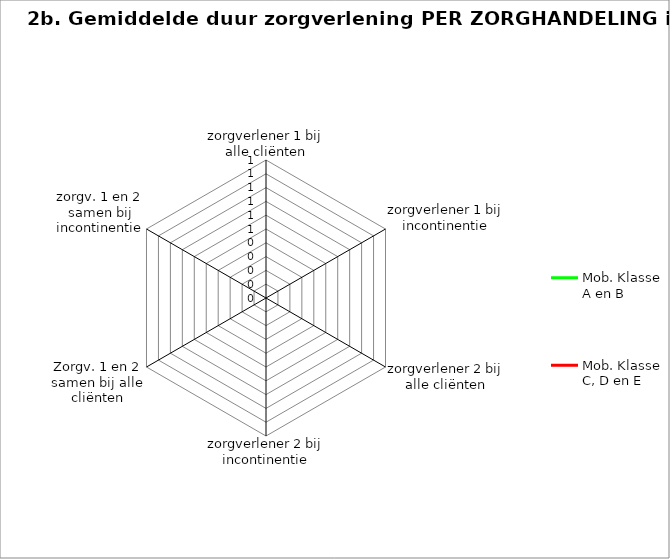
| Category | Mob. Klasse A en B | Mob. Klasse C, D en E |
|---|---|---|
| zorgverlener 1 bij alle cliënten | 0 | 0 |
| zorgverlener 1 bij incontinentie | 0 | 0 |
| zorgverlener 2 bij alle cliënten | 0 | 0 |
| zorgverlener 2 bij incontinentie | 0 | 0 |
| Zorgv. 1 en 2 samen bij alle cliënten | 0 | 0 |
| zorgv. 1 en 2 samen bij incontinentie | 0 | 0 |